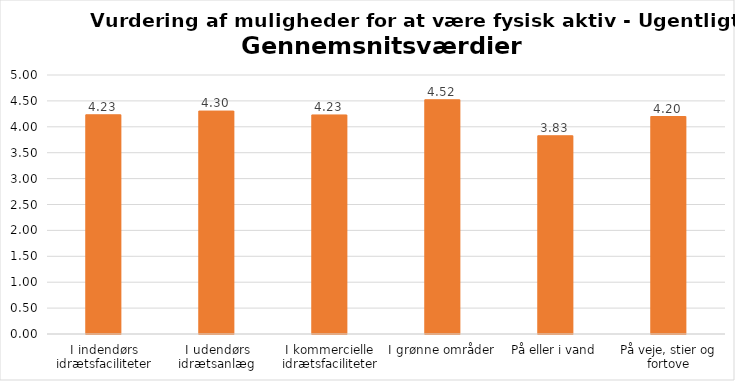
| Category | Gennemsnit |
|---|---|
| I indendørs idrætsfaciliteter | 4.232 |
| I udendørs idrætsanlæg | 4.304 |
| I kommercielle idrætsfaciliteter | 4.229 |
| I grønne områder | 4.522 |
| På eller i vand | 3.827 |
| På veje, stier og fortove | 4.199 |